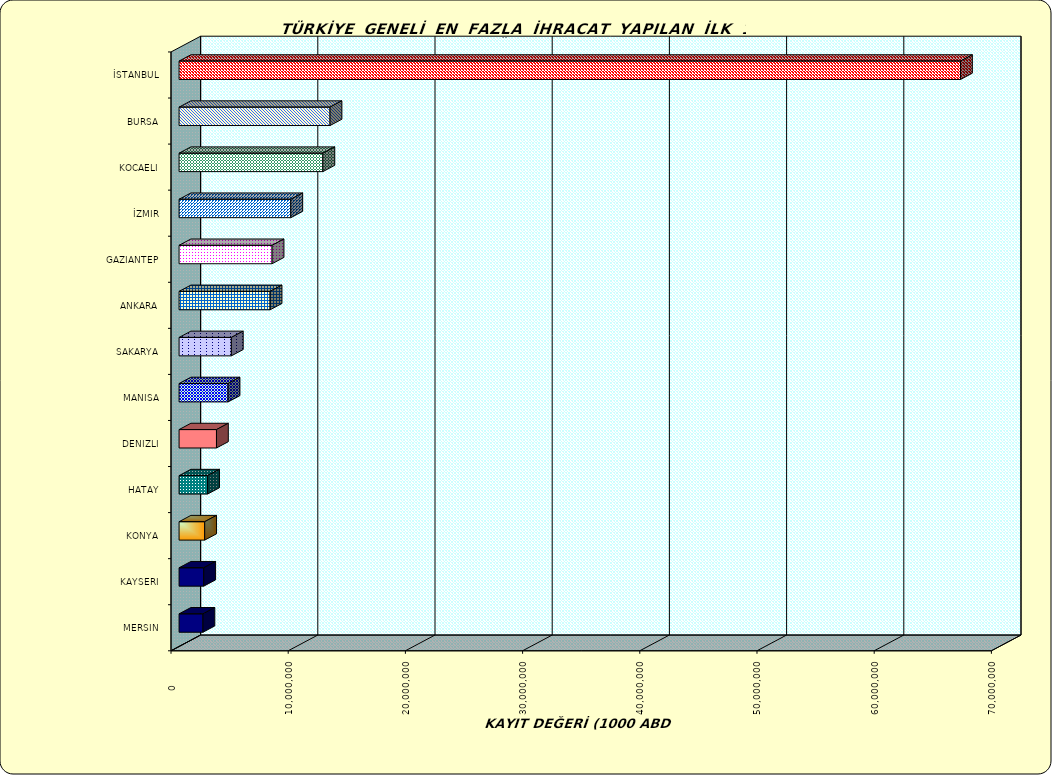
| Category | Series 0 |
|---|---|
| İSTANBUL | 66676873.476 |
| BURSA | 12881227.263 |
| KOCAELI | 12271117.717 |
| İZMIR | 9534711.631 |
| GAZIANTEP | 7935814.048 |
| ANKARA | 7766726.852 |
| SAKARYA | 4459883.216 |
| MANISA | 4180358.685 |
| DENIZLI | 3191333.136 |
| HATAY | 2434045.439 |
| KONYA | 2185137.037 |
| KAYSERI | 2104588.253 |
| MERSIN | 2036000.124 |